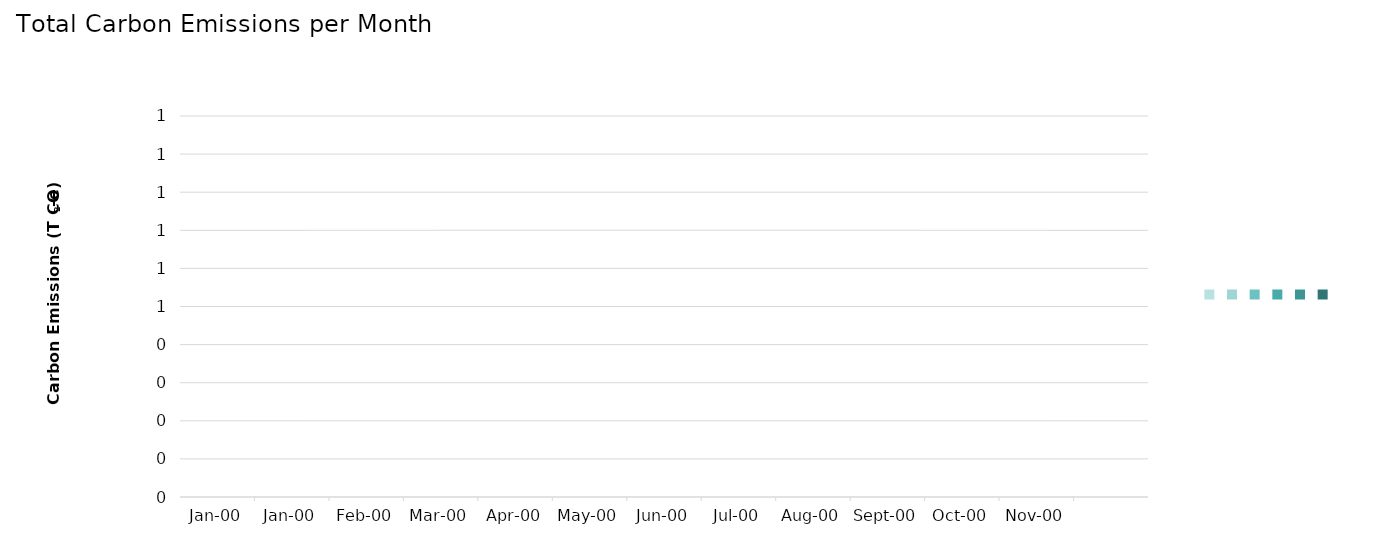
| Category | Series 0 | Series 1 | Series 2 | Series 3 | Series 4 | Series 5 |
|---|---|---|---|---|---|---|
| 0.0 | 0 | 0 | 0 | 0 | 0 | 0 |
| 1900-02-01 | 0 | 0 | 0 | 0 | 0 | 0 |
| 1900-03-01 | 0 | 0 | 0 | 0 | 0 | 0 |
| 1900-04-01 | 0 | 0 | 0 | 0 | 0 | 0 |
| 1900-05-01 | 0 | 0 | 0 | 0 | 0 | 0 |
| 1900-06-01 | 0 | 0 | 0 | 0 | 0 | 0 |
| 1900-07-01 | 0 | 0 | 0 | 0 | 0 | 0 |
| 1900-08-01 | 0 | 0 | 0 | 0 | 0 | 0 |
| 1900-09-01 | 0 | 0 | 0 | 0 | 0 | 0 |
| 1900-10-01 | 0 | 0 | 0 | 0 | 0 | 0 |
| 1900-11-01 | 0 | 0 | 0 | 0 | 0 | 0 |
| 1900-12-01 | 0 | 0 | 0 | 0 | 0 | 0 |